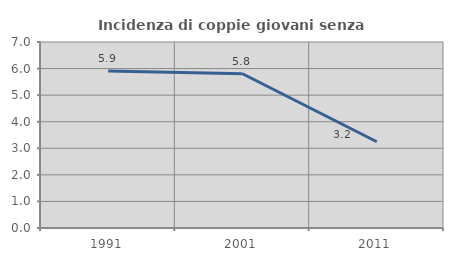
| Category | Incidenza di coppie giovani senza figli |
|---|---|
| 1991.0 | 5.907 |
| 2001.0 | 5.806 |
| 2011.0 | 3.246 |